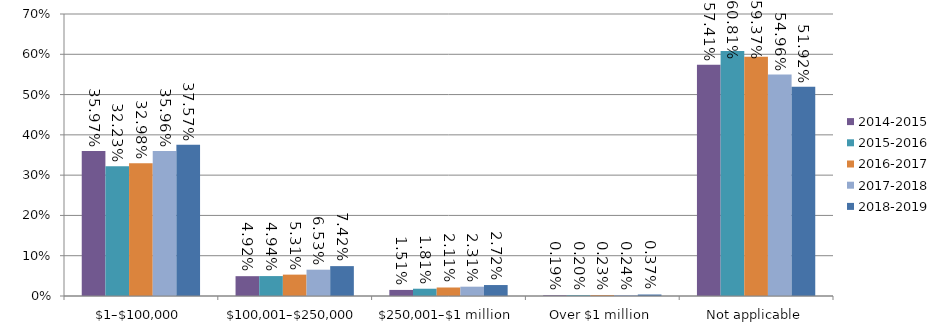
| Category | 2014-2015 | 2015-2016 | 2016-2017 | 2017-2018 | 2018-2019 |
|---|---|---|---|---|---|
| $1–$100,000 | 0.36 | 0.322 | 0.33 | 0.36 | 0.376 |
| $100,001–$250,000 | 0.049 | 0.049 | 0.053 | 0.065 | 0.074 |
| $250,001–$1 million | 0.015 | 0.018 | 0.021 | 0.023 | 0.027 |
| Over $1 million | 0.002 | 0.002 | 0.002 | 0.002 | 0.004 |
| Not applicable | 0.574 | 0.608 | 0.594 | 0.55 | 0.519 |